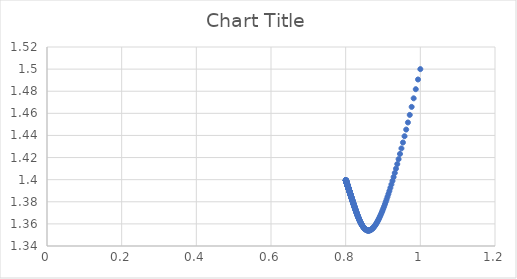
| Category | Series 0 |
|---|---|
| 1.0 | 1.5 |
| 0.99375 | 1.491 |
| 0.987810791015625 | 1.482 |
| 0.9821623132843729 | 1.474 |
| 0.9767861101439786 | 1.466 |
| 0.9716651715548885 | 1.459 |
| 0.9667837957790596 | 1.452 |
| 0.9621274667853412 | 1.445 |
| 0.9576827453180705 | 1.439 |
| 0.9534371718706668 | 1.434 |
| 0.9493791800611364 | 1.428 |
| 0.9454980191204743 | 1.423 |
| 0.9417836843852071 | 1.419 |
| 0.9382268548376169 | 1.414 |
| 0.9348188368662611 | 1.41 |
| 0.9315515135291526 | 1.406 |
| 0.9284172986955416 | 1.402 |
| 0.9254090955222772 | 1.399 |
| 0.9225202587893523 | 1.396 |
| 0.9197445606782494 | 1.393 |
| 0.9170761596275767 | 1.39 |
| 0.9145095719444443 | 1.387 |
| 0.9120396458881146 | 1.385 |
| 0.909661537975531 | 1.382 |
| 0.9073706912871004 | 1.38 |
| 0.9051628155762071 | 1.378 |
| 0.9030338690078655 | 1.376 |
| 0.9009800413711274 | 1.374 |
| 0.8989977386267165 | 1.372 |
| 0.8970835686661787 | 1.371 |
| 0.8952343281718872 | 1.369 |
| 0.8934469904787605 | 1.368 |
| 0.8917186943487282 | 1.367 |
| 0.8900467335779945 | 1.365 |
| 0.8884285473651425 | 1.364 |
| 0.8868617113752242 | 1.363 |
| 0.8853439294412977 | 1.362 |
| 0.8838730258505072 | 1.361 |
| 0.8824469381668197 | 1.361 |
| 0.8810637105470298 | 1.36 |
| 0.8797214875106552 | 1.359 |
| 0.8784185081279549 | 1.358 |
| 0.8771531005935286 | 1.358 |
| 0.8759236771558625 | 1.357 |
| 0.8747287293758016 | 1.357 |
| 0.8735668236892804 | 1.356 |
| 0.8724365972517701 | 1.356 |
| 0.8713367540438176 | 1.356 |
| 0.8702660612187852 | 1.355 |
| 0.8692233456754721 | 1.355 |
| 0.8682074908397188 | 1.355 |
| 0.8672174336403895 | 1.355 |
| 0.8662521616662973 | 1.354 |
| 0.8653107104917053 | 1.354 |
| 0.8643921611590072 | 1.354 |
| 0.8634956378080728 | 1.354 |
| 0.8626203054425544 | 1.354 |
| 0.8617653678241824 | 1.354 |
| 0.8609300654867553 | 1.354 |
| 0.8601136738621423 | 1.354 |
| 0.8593155015111822 | 1.354 |
| 0.8585348884528784 | 1.354 |
| 0.8577712045857648 | 1.354 |
| 0.857023848195752 | 1.354 |
| 0.8562922445451637 | 1.354 |
| 0.8555758445380438 | 1.354 |
| 0.8548741234571483 | 1.355 |
| 0.8541865797683553 | 1.355 |
| 0.8535127339885099 | 1.355 |
| 0.8528521276129885 | 1.355 |
| 0.8522043220995135 | 1.355 |
| 0.8515688979049761 | 1.355 |
| 0.8509454535722348 | 1.356 |
| 0.8503336048640534 | 1.356 |
| 0.8497329839415219 | 1.356 |
| 0.8491432385844724 | 1.356 |
| 0.8485640314515562 | 1.357 |
| 0.8479950393777941 | 1.357 |
| 0.8474359527075457 | 1.357 |
| 0.8468864746609694 | 1.357 |
| 0.8463463207321601 | 1.358 |
| 0.8458152181172601 | 1.358 |
| 0.8452929051709421 | 1.358 |
| 0.8447791308897543 | 1.358 |
| 0.844273654420908 | 1.359 |
| 0.8437762445951696 | 1.359 |
| 0.8432866794825974 | 1.359 |
| 0.8428047459699318 | 1.359 |
| 0.8423302393585202 | 1.36 |
| 0.8418629629817163 | 1.36 |
| 0.8414027278407553 | 1.36 |
| 0.8409493522581629 | 1.361 |
| 0.8405026615478035 | 1.361 |
| 0.8400624877007278 | 1.361 |
| 0.8396286690860213 | 1.361 |
| 0.8392010501659012 | 1.362 |
| 0.8387794812243479 | 1.362 |
| 0.8383638181085966 | 1.362 |
| 0.8379539219828502 | 1.363 |
| 0.837549659093608 | 1.363 |
| 0.8371509005460372 | 1.363 |
| 0.8367575220908443 | 1.364 |
| 0.8363694039211305 | 1.364 |
| 0.8359864304787442 | 1.364 |
| 0.8356084902696674 | 1.364 |
| 0.8352354756879953 | 1.365 |
| 0.8348672828480945 | 1.365 |
| 0.8345038114245436 | 1.365 |
| 0.8341449644994796 | 1.366 |
| 0.8337906484169967 | 1.366 |
| 0.8334407726442546 | 1.366 |
| 0.8330952496389801 | 1.367 |
| 0.8327539947230511 | 1.367 |
| 0.8324169259618782 | 1.367 |
| 0.8320839640493035 | 1.367 |
| 0.8317550321977579 | 1.368 |
| 0.8314300560334251 | 1.368 |
| 0.8311089634961777 | 1.368 |
| 0.830791684744058 | 1.369 |
| 0.8304781520620907 | 1.369 |
| 0.8301682997752233 | 1.369 |
| 0.8298620641651994 | 1.369 |
| 0.8295593833911814 | 1.37 |
| 0.8292601974139473 | 1.37 |
| 0.8289644479234929 | 1.37 |
| 0.828672078269882 | 1.371 |
| 0.8283830333971922 | 1.371 |
| 0.8280972597804132 | 1.371 |
| 0.8278147053651582 | 1.371 |
| 0.8275353195100612 | 1.372 |
| 0.8272590529317316 | 1.372 |
| 0.8269858576521515 | 1.372 |
| 0.8267156869483999 | 1.372 |
| 0.8264484953045981 | 1.373 |
| 0.8261842383659723 | 1.373 |
| 0.8259228728949378 | 1.373 |
| 0.8256643567291093 | 1.373 |
| 0.8254086487411514 | 1.374 |
| 0.8251557088003825 | 1.374 |
| 0.8249054977360532 | 1.374 |
| 0.8246579773022216 | 1.374 |
| 0.8244131101441534 | 1.375 |
| 0.8241708597661758 | 1.375 |
| 0.8239311905009198 | 1.375 |
| 0.8236940674798874 | 1.375 |
| 0.8234594566052831 | 1.376 |
| 0.8232273245230525 | 1.376 |
| 0.8229976385970725 | 1.376 |
| 0.822770366884442 | 1.376 |
| 0.8225454781118218 | 1.377 |
| 0.8223229416527766 | 1.377 |
| 0.8221027275060753 | 1.377 |
| 0.8218848062749032 | 1.377 |
| 0.8216691491469482 | 1.377 |
| 0.821455727875319 | 1.378 |
| 0.8212445147602592 | 1.378 |
| 0.8210354826316218 | 1.378 |
| 0.8208286048320688 | 1.378 |
| 0.820623855200963 | 1.379 |
| 0.8204212080589239 | 1.379 |
| 0.8202206381930143 | 1.379 |
| 0.8200221208425313 | 1.379 |
| 0.8198256316853751 | 1.379 |
| 0.8196311468249683 | 1.38 |
| 0.8194386427777026 | 1.38 |
| 0.8192480964608889 | 1.38 |
| 0.8190594851811882 | 1.38 |
| 0.8188727866235023 | 1.38 |
| 0.8186879788403038 | 1.381 |
| 0.8185050402413863 | 1.381 |
| 0.8183239495840158 | 1.381 |
| 0.8181446859634656 | 1.381 |
| 0.8179672288039186 | 1.381 |
| 0.8177915578497196 | 1.381 |
| 0.8176176531569636 | 1.382 |
| 0.817445495085404 | 1.382 |
| 0.8172750642906683 | 1.382 |
| 0.8171063417167665 | 1.382 |
| 0.8169393085888799 | 1.382 |
| 0.8167739464064183 | 1.382 |
| 0.8166102369363347 | 1.383 |
| 0.816448162206684 | 1.383 |
| 0.8162877045004179 | 1.383 |
| 0.8161288463494041 | 1.383 |
| 0.815971570528661 | 1.383 |
| 0.8158158600507978 | 1.383 |
| 0.815661698160652 | 1.384 |
| 0.8155090683301164 | 1.384 |
| 0.8153579542531447 | 1.384 |
| 0.8152083398409329 | 1.384 |
| 0.8150602092172635 | 1.384 |
| 0.814913546714011 | 1.384 |
| 0.8147683368667968 | 1.385 |
| 0.8146245644107927 | 1.385 |
| 0.8144822142766605 | 1.385 |
| 0.8143412715866282 | 1.385 |
| 0.8142017216506927 | 1.385 |
| 0.814063549962946 | 1.385 |
| 0.8139267421980185 | 1.385 |
| 0.8137912842076358 | 1.386 |
| 0.8136571620172832 | 1.386 |
| 0.8135243618229747 | 1.386 |
| 0.8133928699881209 | 1.386 |
| 0.8132626730404926 | 1.386 |
| 0.8131337576692764 | 1.386 |
| 0.8130061107222178 | 1.386 |
| 0.8128797192028493 | 1.387 |
| 0.812754570267799 | 1.387 |
| 0.8126306512241773 | 1.387 |
| 0.8125079495270389 | 1.387 |
| 0.8123864527769153 | 1.387 |
| 0.812266148717418 | 1.387 |
| 0.8121470252329064 | 1.387 |
| 0.8120290703462206 | 1.387 |
| 0.8119122722164752 | 1.388 |
| 0.8117966191369115 | 1.388 |
| 0.811682099532807 | 1.388 |
| 0.8115687019594393 | 1.388 |
| 0.8114564151001021 | 1.388 |
| 0.8113452277641723 | 1.388 |
| 0.8112351288852249 | 1.388 |
| 0.8111261075191954 | 1.388 |
| 0.8110181528425875 | 1.389 |
| 0.8109112541507227 | 1.389 |
| 0.8108054008560338 | 1.389 |
| 0.8107005824863973 | 1.389 |
| 0.8105967886835052 | 1.389 |
| 0.810494009201274 | 1.389 |
| 0.8103922339042909 | 1.389 |
| 0.8102914527662931 | 1.389 |
| 0.8101916558686824 | 1.389 |
| 0.8100928333990716 | 1.389 |
| 0.8099949756498622 | 1.39 |
| 0.8098980730168532 | 1.39 |
| 0.8098021159978782 | 1.39 |
| 0.8097070951914713 | 1.39 |
| 0.8096130012955607 | 1.39 |
| 0.8095198251061881 | 1.39 |
| 0.8094275575162547 | 1.39 |
| 0.8093361895142908 | 1.39 |
| 0.80924571218325 | 1.39 |
| 0.8091561166993275 | 1.39 |
| 0.809067394330799 | 1.391 |
| 0.808979536436883 | 1.391 |
| 0.8088925344666238 | 1.391 |
| 0.8088063799577947 | 1.391 |
| 0.8087210645358213 | 1.391 |
| 0.8086365799127241 | 1.391 |
| 0.8085529178860797 | 1.391 |
| 0.8084700703380007 | 1.391 |
| 0.8083880292341317 | 1.391 |
| 0.8083067866226645 | 1.391 |
| 0.8082263346333688 | 1.391 |
| 0.8081466654766386 | 1.392 |
| 0.8080677714425556 | 1.392 |
| 0.8079896448999669 | 1.392 |
| 0.8079122782955782 | 1.392 |
| 0.8078356641530607 | 1.392 |
| 0.8077597950721734 | 1.392 |
| 0.8076846637278975 | 1.392 |
| 0.8076102628695856 | 1.392 |
| 0.8075365853201232 | 1.392 |
| 0.8074636239751029 | 1.392 |
| 0.8073913718020114 | 1.392 |
| 0.8073198218394283 | 1.392 |
| 0.8072489671962366 | 1.392 |
| 0.807178801050845 | 1.393 |
| 0.807109316650421 | 1.393 |
| 0.8070405073101353 | 1.393 |
| 0.8069723664124173 | 1.393 |
| 0.8069048874062201 | 1.393 |
| 0.8068380638062963 | 1.393 |
| 0.8067718891924841 | 1.393 |
| 0.8067063572090024 | 1.393 |
| 0.8066414615637564 | 1.393 |
| 0.8065771960276515 | 1.393 |
| 0.8065135544339177 | 1.393 |
| 0.8064505306774414 | 1.393 |
| 0.8063881187141075 | 1.393 |
| 0.8063263125601489 | 1.393 |
| 0.8062651062915052 | 1.393 |
| 0.8062044940431895 | 1.394 |
| 0.8061444700086631 | 1.394 |
| 0.8060850284392181 | 1.394 |
| 0.8060261636433685 | 1.394 |
| 0.8059678699862478 | 1.394 |
| 0.805910141889015 | 1.394 |
| 0.8058529738282677 | 1.394 |
| 0.8057963603354624 | 1.394 |
| 0.8057402959963418 | 1.394 |
| 0.8056847754503691 | 1.394 |
| 0.8056297933901695 | 1.394 |
| 0.8055753445609778 | 1.394 |
| 0.8055214237600933 | 1.394 |
| 0.8054680258363404 | 1.394 |
| 0.8054151456895364 | 1.394 |
| 0.8053627782699653 | 1.394 |
| 0.8053109185778572 | 1.394 |
| 0.8052595616628747 | 1.395 |
| 0.8052087026236048 | 1.395 |
| 0.8051583366070564 | 1.395 |
| 0.8051084588081642 | 1.395 |
| 0.8050590644692981 | 1.395 |
| 0.805010148879778 | 1.395 |
| 0.8049617073753939 | 1.395 |
| 0.8049137353379323 | 1.395 |
| 0.8048662281947073 | 1.395 |
| 0.8048191814180969 | 1.395 |
| 0.804772590525085 | 1.395 |
| 0.8047264510768078 | 1.395 |
| 0.8046807586781064 | 1.395 |
| 0.8046355089770828 | 1.395 |
| 0.8045906976646623 | 1.395 |
| 0.8045463204741599 | 1.395 |
| 0.8045023731808514 | 1.395 |
| 0.80445885160155 | 1.395 |
| 0.8044157515941864 | 1.395 |
| 0.8043730690573947 | 1.395 |
| 0.8043307999301016 | 1.396 |
| 0.8042889401911208 | 1.396 |
| 0.8042474858587519 | 1.396 |
| 0.804206432990383 | 1.396 |
| 0.804165777682098 | 1.396 |
| 0.8041255160682881 | 1.396 |
| 0.8040856443212676 | 1.396 |
| 0.8040461586508931 | 1.396 |
| 0.8040070553041879 | 1.396 |
| 0.8039683305649691 | 1.396 |
| 0.8039299807534798 | 1.396 |
| 0.8038920022260246 | 1.396 |
| 0.8038543913746091 | 1.396 |
| 0.8038171446265833 | 1.396 |
| 0.8037802584442881 | 1.396 |
| 0.803743729324707 | 1.396 |
| 0.8037075537991196 | 1.396 |
| 0.8036717284327605 | 1.396 |
| 0.8036362498244801 | 1.396 |
| 0.8036011146064105 | 1.396 |
| 0.8035663194436338 | 1.396 |
| 0.8035318610338541 | 1.396 |
| 0.8034977361070734 | 1.396 |
| 0.8034639414252704 | 1.396 |
| 0.8034304737820825 | 1.396 |
| 0.8033973300024915 | 1.396 |
| 0.8033645069425123 | 1.397 |
| 0.8033320014888852 | 1.397 |
| 0.8032998105587706 | 1.397 |
| 0.8032679310994478 | 1.397 |
| 0.803236360088016 | 1.397 |
| 0.803205094531099 | 1.397 |
| 0.8031741314645527 | 1.397 |
| 0.8031434679531758 | 1.397 |
| 0.803113101090423 | 1.397 |
| 0.8030830279981216 | 1.397 |
| 0.8030532458261909 | 1.397 |
| 0.8030237517523642 | 1.397 |
| 0.8029945429819141 | 1.397 |
| 0.8029656167473802 | 1.397 |
| 0.8029369703082996 | 1.397 |
| 0.8029086009509403 | 1.397 |
| 0.8028805059880377 | 1.397 |
| 0.8028526827585327 | 1.397 |
| 0.8028251286273136 | 1.397 |
| 0.8027978409849597 | 1.397 |
| 0.8027708172474884 | 1.397 |
| 0.8027440548561042 | 1.397 |
| 0.8027175512769503 | 1.397 |
| 0.802691304000863 | 1.397 |
| 0.8026653105431283 | 1.397 |
| 0.8026395684432412 | 1.397 |
| 0.8026140752646674 | 1.397 |
| 0.802588828594607 | 1.397 |
| 0.8025638260437613 | 1.397 |
| 0.8025390652461013 | 1.397 |
| 0.8025145438586389 | 1.397 |
| 0.8024902595612 | 1.397 |
| 0.8024662100562009 | 1.397 |
| 0.8024423930684252 | 1.397 |
| 0.8024188063448048 | 1.397 |
| 0.8023954476542018 | 1.398 |
| 0.8023723147871932 | 1.398 |
| 0.8023494055558577 | 1.398 |
| 0.8023267177935642 | 1.398 |
| 0.8023042493547634 | 1.398 |
| 0.8022819981147801 | 1.398 |
| 0.8022599619696086 | 1.398 |
| 0.8022381388357102 | 1.398 |
| 0.8022165266498119 | 1.398 |
| 0.8021951233687081 | 1.398 |
| 0.8021739269690633 | 1.398 |
| 0.8021529354472176 | 1.398 |
| 0.8021321468189936 | 1.398 |
| 0.8021115591195056 | 1.398 |
| 0.8020911704029704 | 1.398 |
| 0.8020709787425203 | 1.398 |
| 0.8020509822300176 | 1.398 |
| 0.802031178975871 | 1.398 |
| 0.8020115671088541 | 1.398 |
| 0.8019921447759261 | 1.398 |
| 0.8019729101420526 | 1.398 |
| 0.8019538613900304 | 1.398 |
| 0.8019349967203124 | 1.398 |
| 0.8019163143508349 | 1.398 |
| 0.8018978125168466 | 1.398 |
| 0.8018794894707391 | 1.398 |
| 0.8018613434818794 | 1.398 |
| 0.8018433728364439 | 1.398 |
| 0.8018255758372538 | 1.398 |
| 0.8018079508036122 | 1.398 |
| 0.8017904960711435 | 1.398 |
| 0.8017732099916334 | 1.398 |
| 0.8017560909328711 | 1.398 |
| 0.801739137278493 | 1.398 |
| 0.8017223474278277 | 1.398 |
| 0.8017057197957426 | 1.398 |
| 0.8016892528124925 | 1.398 |
| 0.8016729449235688 | 1.398 |
| 0.8016567945895511 | 1.398 |
| 0.8016408002859596 | 1.398 |
| 0.8016249605031095 | 1.398 |
| 0.8016092737459661 | 1.398 |
| 0.8015937385340023 | 1.398 |
| 0.8015783534010567 | 1.398 |
| 0.8015631168951933 | 1.398 |
| 0.8015480275785632 | 1.398 |
| 0.8015330840272666 | 1.398 |
| 0.8015182848312169 | 1.398 |
| 0.8015036285940061 | 1.398 |
| 0.8014891139327712 | 1.398 |
| 0.8014747394780621 | 1.398 |
| 0.801460503873711 | 1.398 |
| 0.8014464057767027 | 1.399 |
| 0.8014324438570463 | 1.399 |
| 0.8014186167976485 | 1.399 |
| 0.8014049232941876 | 1.399 |
| 0.8013913620549893 | 1.399 |
| 0.8013779318009032 | 1.399 |
| 0.8013646312651809 | 1.399 |
| 0.8013514591933549 | 1.399 |
| 0.8013384143431196 | 1.399 |
| 0.801325495484212 | 1.399 |
| 0.8013127013982949 | 1.399 |
| 0.8013000308788407 | 1.399 |
| 0.8012874827310162 | 1.399 |
| 0.8012750557715689 | 1.399 |
| 0.801262748828714 | 1.399 |
| 0.8012505607420232 | 1.399 |
| 0.8012384903623135 | 1.399 |
| 0.8012265365515385 | 1.399 |
| 0.8012146981826792 | 1.399 |
| 0.8012029741396373 | 1.399 |
| 0.8011913633171284 | 1.399 |
| 0.8011798646205773 | 1.399 |
| 0.8011684769660135 | 1.399 |
| 0.8011571992799679 | 1.399 |
| 0.8011460304993709 | 1.399 |
| 0.8011349695714512 | 1.399 |
| 0.8011240154536354 | 1.399 |
| 0.8011131671134489 | 1.399 |
| 0.801102423528418 | 1.399 |
| 0.8010917836859721 | 1.399 |
| 0.8010812465833479 | 1.399 |
| 0.8010708112274936 | 1.399 |
| 0.8010604766349749 | 1.399 |
| 0.8010502418318813 | 1.399 |
| 0.8010401058537335 | 1.399 |
| 0.8010300677453915 | 1.399 |
| 0.8010201265609644 | 1.399 |
| 0.8010102813637201 | 1.399 |
| 0.8010005312259961 | 1.399 |
| 0.800990875229112 | 1.399 |
| 0.8009813124632816 | 1.399 |
| 0.8009718420275268 | 1.399 |
| 0.800962463029592 | 1.399 |
| 0.8009531745858591 | 1.399 |
| 0.8009439758212643 | 1.399 |
| 0.800934865869214 | 1.399 |
| 0.8009258438715033 | 1.399 |
| 0.8009169089782342 | 1.399 |
| 0.8009080603477349 | 1.399 |
| 0.8008992971464802 | 1.399 |
| 0.8008906185490121 | 1.399 |
| 0.8008820237378617 | 1.399 |
| 0.8008735119034711 | 1.399 |
| 0.8008650822441175 | 1.399 |
| 0.8008567339658362 | 1.399 |
| 0.8008484662823462 | 1.399 |
| 0.8008402784149746 | 1.399 |
| 0.8008321695925836 | 1.399 |
| 0.8008241390514971 | 1.399 |
| 0.8008161860354279 | 1.399 |
| 0.8008083097954067 | 1.399 |
| 0.8008005095897105 | 1.399 |
| 0.8007927846837926 | 1.399 |
| 0.8007851343502127 | 1.399 |
| 0.8007775578685683 | 1.399 |
| 0.8007700545254262 | 1.399 |
| 0.8007626236142548 | 1.399 |
| 0.8007552644353575 | 1.399 |
| 0.800747976295806 | 1.399 |
| 0.8007407585093748 | 1.399 |
| 0.8007336103964763 | 1.399 |
| 0.8007265312840962 | 1.399 |
| 0.8007195205057301 | 1.399 |
| 0.80071257740132 | 1.399 |
| 0.8007057013171918 | 1.399 |
| 0.8006988916059937 | 1.399 |
| 0.8006921476266349 | 1.399 |
| 0.8006854687442243 | 1.399 |
| 0.8006788543300111 | 1.399 |
| 0.8006723037613248 | 1.399 |
| 0.8006658164215166 | 1.399 |
| 0.8006593916999006 | 1.399 |
| 0.8006530289916968 | 1.399 |
| 0.8006467276979726 | 1.399 |
| 0.8006404872255873 | 1.399 |
| 0.8006343069871354 | 1.399 |
| 0.8006281864008912 | 1.399 |
| 0.8006221248907534 | 1.399 |
| 0.8006161218861909 | 1.399 |
| 0.8006101768221892 | 1.399 |
| 0.8006042891391959 | 1.399 |
| 0.800598458283069 | 1.399 |
| 0.8005926837050233 | 1.399 |
| 0.8005869648615797 | 1.399 |
| 0.8005813012145125 | 1.399 |
| 0.8005756922307998 | 1.399 |
| 0.800570137382572 | 1.399 |
| 0.8005646361470625 | 1.399 |
| 0.8005591880065582 | 1.399 |
| 0.8005537924483503 | 1.399 |
| 0.8005484489646862 | 1.399 |
| 0.800543157052721 | 1.399 |
| 0.8005379162144706 | 1.399 |
| 0.800532725956764 | 1.399 |
| 0.800527585791197 | 1.399 |
| 0.8005224952340861 | 1.399 |
| 0.8005174538064228 | 1.399 |
| 0.8005124610338279 | 1.399 |
| 0.8005075164465071 | 1.399 |
| 0.8005026195792067 | 1.399 |
| 0.8004977699711691 | 1.399 |
| 0.8004929671660899 | 1.399 |